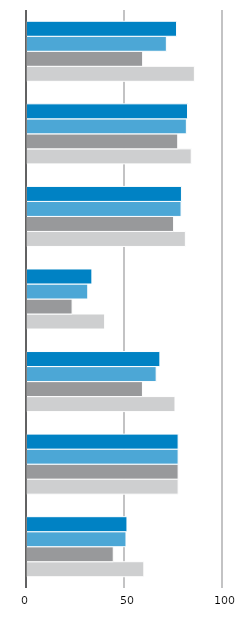
| Category | Summe von Maximum | Summe von Minimum | Summe von Deutschland | Summe von Anteil an den Beschäftigten insg. In % wB |
|---|---|---|---|---|
| 7 | 59.6 | 44 | 50.5 | 51 |
| 6 | 77.1 | 77.1 | 77.1 | 77.1 |
| 5 | 75.5 | 58.9 | 65.9 | 67.8 |
| 4 | 39.6 | 23 | 31 | 33.1 |
| 3 | 80.8 | 74.8 | 78.6 | 78.8 |
| 2 | 83.8 | 76.9 | 81.3 | 81.9 |
| 1 | 85.4 | 59 | 71.1 | 76.3 |